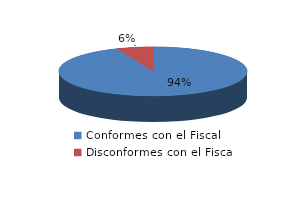
| Category | Series 0 |
|---|---|
| 0 | 45 |
| 1 | 3 |